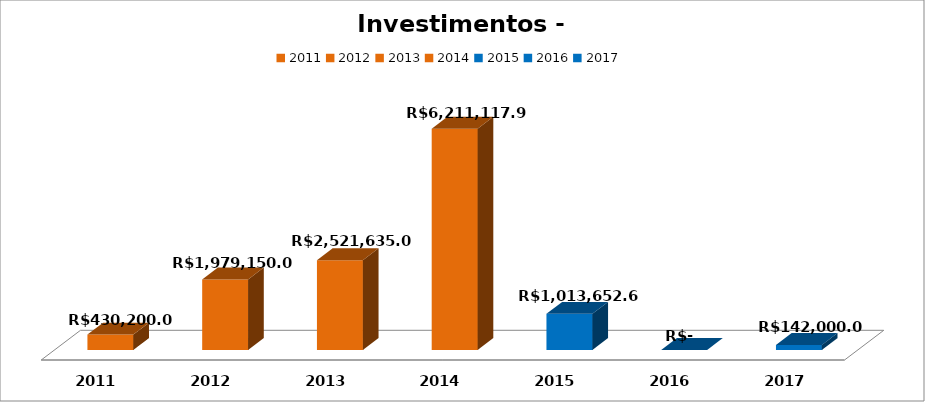
| Category | Series 1 |
|---|---|
| 2011.0 | 430200 |
| 2012.0 | 1979150 |
| 2013.0 | 2521635 |
| 2014.0 | 6211117.98 |
| 2015.0 | 1013652.68 |
| 2016.0 | 0 |
| 2017.0 | 142000 |